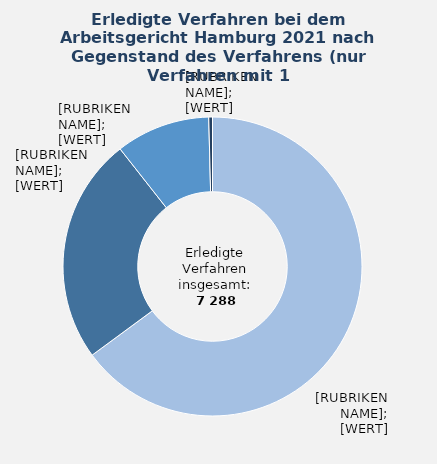
| Category | in Prozent |
|---|---|
| Bestandsstreitigkeiten (insbesondere Kündigungen) | 64.9 |
| Zahlungsklagen | 24.5 |
| Sonstiges | 10.2 |
| Tarifliche Eingruppierung | 0.4 |